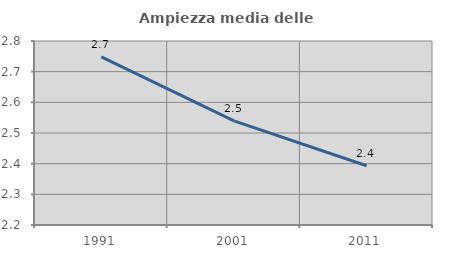
| Category | Ampiezza media delle famiglie |
|---|---|
| 1991.0 | 2.748 |
| 2001.0 | 2.539 |
| 2011.0 | 2.393 |